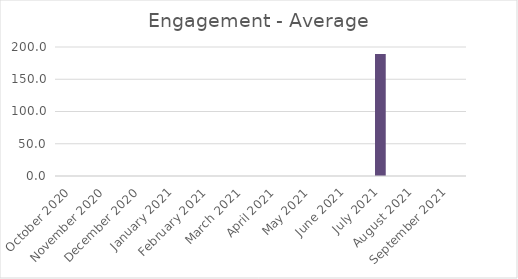
| Category | Average |
|---|---|
| October 2020 | 0 |
| November 2020 | 0 |
| December 2020 | 0 |
| January 2021 | 0 |
| February 2021 | 0 |
| March 2021 | 0 |
| April 2021 | 0 |
| May 2021 | 0 |
| June 2021 | 0 |
| July 2021 | 189.058 |
| August 2021 | 0 |
| September 2021 | 0 |